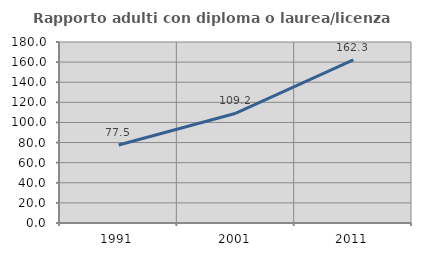
| Category | Rapporto adulti con diploma o laurea/licenza media  |
|---|---|
| 1991.0 | 77.54 |
| 2001.0 | 109.174 |
| 2011.0 | 162.255 |